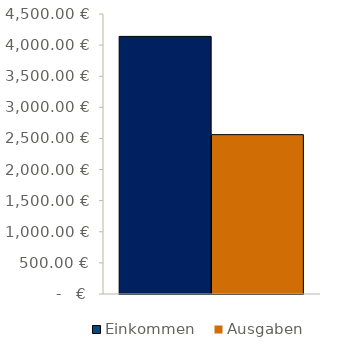
| Category | Einkommen | Ausgaben |
|---|---|---|
| 0 | 4140 | 2561 |